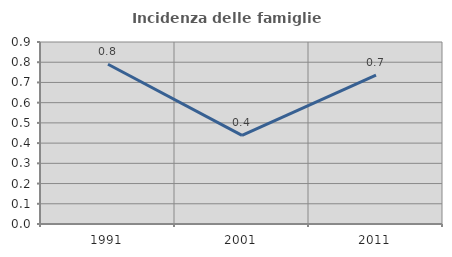
| Category | Incidenza delle famiglie numerose |
|---|---|
| 1991.0 | 0.79 |
| 2001.0 | 0.438 |
| 2011.0 | 0.736 |